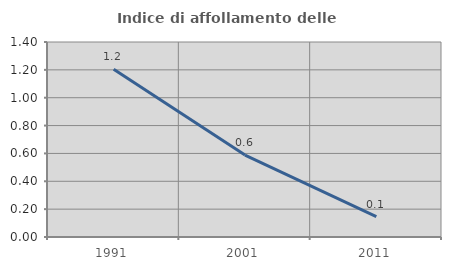
| Category | Indice di affollamento delle abitazioni  |
|---|---|
| 1991.0 | 1.205 |
| 2001.0 | 0.588 |
| 2011.0 | 0.146 |